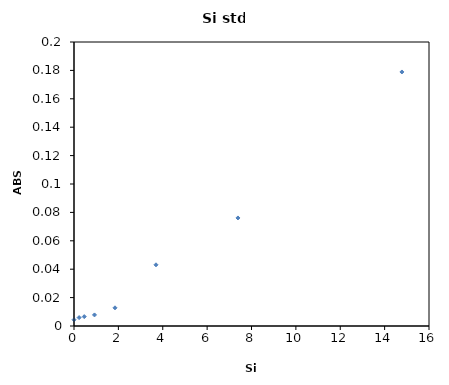
| Category | Series 0 |
|---|---|
| 0.0 | 0.004 |
| 0.230911330049261 | 0.006 |
| 0.461822660098522 | 0.007 |
| 0.923645320197044 | 0.008 |
| 1.847290640394088 | 0.013 |
| 3.694581280788177 | 0.043 |
| 7.389162561576354 | 0.076 |
| 14.77832512315271 | 0.179 |